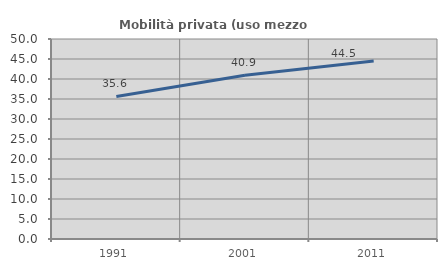
| Category | Mobilità privata (uso mezzo privato) |
|---|---|
| 1991.0 | 35.633 |
| 2001.0 | 40.933 |
| 2011.0 | 44.502 |